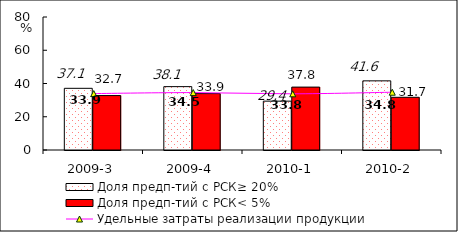
| Category | Доля предп-тий с РСК≥ 20% | Доля предп-тий с РСК< 5% |
|---|---|---|
| 2009-3 | 37.097 | 32.742 |
| 2009-4 | 38.119 | 33.937 |
| 2010-1 | 29.382 | 37.833 |
| 2010-2 | 41.596 | 31.695 |